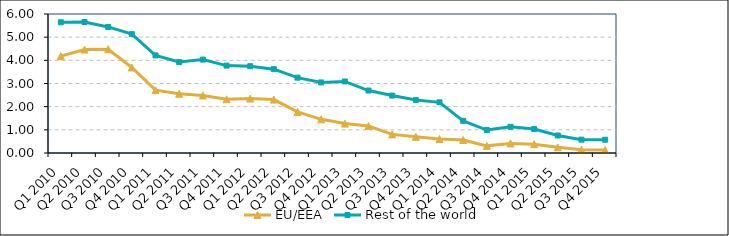
| Category | EU/EEA | Rest of the world |
|---|---|---|
| Q1 2010 | 4.182 | 5.642 |
| Q2 2010 | 4.464 | 5.654 |
| Q3 2010 | 4.478 | 5.442 |
| Q4 2010 | 3.692 | 5.13 |
| Q1 2011 | 2.714 | 4.212 |
| Q2 2011 | 2.558 | 3.925 |
| Q3 2011 | 2.486 | 4.032 |
| Q4 2011 | 2.318 | 3.773 |
| Q1 2012 | 2.351 | 3.746 |
| Q2 2012 | 2.305 | 3.62 |
| Q3 2012 | 1.773 | 3.253 |
| Q4 2012 | 1.453 | 3.046 |
| Q1 2013 | 1.271 | 3.088 |
| Q2 2013 | 1.163 | 2.697 |
| Q3 2013 | 0.804 | 2.479 |
| Q4 2013 | 0.7 | 2.285 |
| Q1 2014 | 0.604 | 2.187 |
| Q2 2014 | 0.561 | 1.389 |
| Q3 2014 | 0.308 | 0.99 |
| Q4 2014 | 0.415 | 1.129 |
| Q1 2015 | 0.379 | 1.037 |
| Q2 2015 | 0.245 | 0.756 |
| Q3 2015 | 0.142 | 0.576 |
| Q4 2015 | 0.128 | 0.574 |